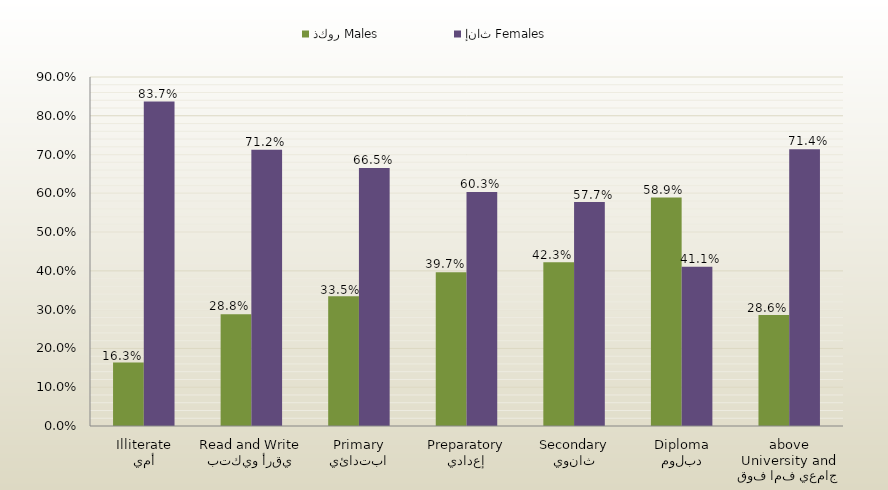
| Category | ذكور Males | إناث Females |
|---|---|---|
| أمي
Illiterate | 0.163 | 0.837 |
| يقرأ ويكتب
Read and Write | 0.288 | 0.712 |
| ابتدائي
Primary | 0.335 | 0.665 |
| إعدادي
Preparatory | 0.397 | 0.603 |
| ثانوي
Secondary | 0.423 | 0.577 |
| دبلوم
Diploma | 0.589 | 0.411 |
| جامعي فما فوق
University and above | 0.286 | 0.714 |